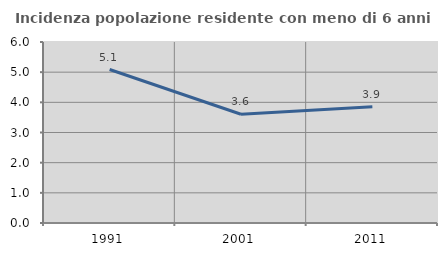
| Category | Incidenza popolazione residente con meno di 6 anni |
|---|---|
| 1991.0 | 5.088 |
| 2001.0 | 3.604 |
| 2011.0 | 3.854 |